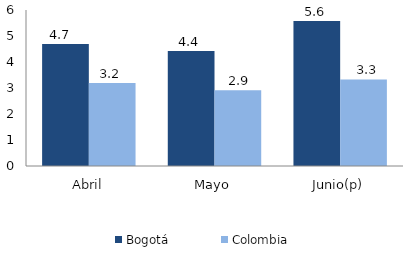
| Category | Bogotá | Colombia |
|---|---|---|
| Abril | 4.688 | 3.194 |
| Mayo | 4.426 | 2.911 |
| Junio(p) | 5.575 | 3.33 |